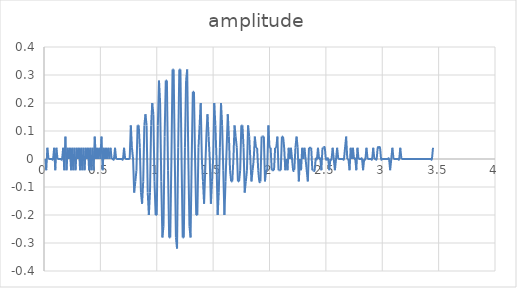
| Category | amplitude |
|---|---|
| 0.01 | 0 |
| 0.02 | -0.04 |
| 0.03 | 0.04 |
| 0.04 | 0 |
| 0.05 | 0 |
| 0.060000000000000005 | 0 |
| 0.07 | 0 |
| 0.08 | 0 |
| 0.09 | 0.04 |
| 0.09999999999999999 | -0.04 |
| 0.10999999999999999 | 0.04 |
| 0.11999999999999998 | 0 |
| 0.12999999999999998 | 0 |
| 0.13999999999999999 | 0 |
| 0.15 | 0 |
| 0.16 | 0 |
| 0.17 | 0.04 |
| 0.18000000000000002 | -0.04 |
| 0.19000000000000003 | 0.08 |
| 0.20000000000000004 | -0.04 |
| 0.21000000000000005 | 0.04 |
| 0.22000000000000006 | 0 |
| 0.23000000000000007 | 0.04 |
| 0.24000000000000007 | -0.04 |
| 0.25000000000000006 | 0.04 |
| 0.26000000000000006 | -0.04 |
| 0.2700000000000001 | 0.04 |
| 0.2800000000000001 | -0.04 |
| 0.2900000000000001 | 0.04 |
| 0.3000000000000001 | 0 |
| 0.3100000000000001 | 0.04 |
| 0.3200000000000001 | -0.04 |
| 0.3300000000000001 | 0.04 |
| 0.34000000000000014 | -0.04 |
| 0.35000000000000014 | 0.04 |
| 0.36000000000000015 | -0.04 |
| 0.37000000000000016 | 0.04 |
| 0.38000000000000017 | 0 |
| 0.3900000000000002 | 0.04 |
| 0.4000000000000002 | -0.04 |
| 0.4100000000000002 | 0.04 |
| 0.4200000000000002 | -0.04 |
| 0.4300000000000002 | 0.04 |
| 0.4400000000000002 | -0.04 |
| 0.45000000000000023 | 0.08 |
| 0.46000000000000024 | 0 |
| 0.47000000000000025 | 0.04 |
| 0.48000000000000026 | 0 |
| 0.49000000000000027 | 0.04 |
| 0.5000000000000002 | 0 |
| 0.5100000000000002 | 0.08 |
| 0.5200000000000002 | -0.04 |
| 0.5300000000000002 | 0.04 |
| 0.5400000000000003 | 0 |
| 0.5500000000000003 | 0.04 |
| 0.5600000000000003 | 0 |
| 0.5700000000000003 | 0.04 |
| 0.5800000000000003 | 0 |
| 0.5900000000000003 | 0.04 |
| 0.6000000000000003 | 0 |
| 0.6100000000000003 | 0 |
| 0.6200000000000003 | 0 |
| 0.6300000000000003 | 0.04 |
| 0.6400000000000003 | 0 |
| 0.6500000000000004 | 0 |
| 0.6600000000000004 | 0 |
| 0.6700000000000004 | 0 |
| 0.6800000000000004 | 0 |
| 0.6900000000000004 | 0 |
| 0.7000000000000004 | 0 |
| 0.7100000000000004 | 0.04 |
| 0.7200000000000004 | 0 |
| 0.7300000000000004 | 0 |
| 0.7400000000000004 | 0 |
| 0.7500000000000004 | 0 |
| 0.7600000000000005 | 0 |
| 0.7700000000000005 | 0.12 |
| 0.7800000000000005 | 0.04 |
| 0.7900000000000005 | 0 |
| 0.8000000000000005 | -0.12 |
| 0.8100000000000005 | -0.08 |
| 0.8200000000000005 | -0.04 |
| 0.8300000000000005 | 0.12 |
| 0.8400000000000005 | 0.12 |
| 0.8500000000000005 | 0.04 |
| 0.8600000000000005 | -0.12 |
| 0.8700000000000006 | -0.16 |
| 0.8800000000000006 | -0.08 |
| 0.8900000000000006 | 0.12 |
| 0.9000000000000006 | 0.16 |
| 0.9100000000000006 | 0.12 |
| 0.9200000000000006 | -0.12 |
| 0.9300000000000006 | -0.2 |
| 0.9400000000000006 | -0.12 |
| 0.9500000000000006 | 0.12 |
| 0.9600000000000006 | 0.2 |
| 0.9700000000000006 | 0.16 |
| 0.9800000000000006 | -0.08 |
| 0.9900000000000007 | -0.2 |
| 1.0000000000000007 | -0.2 |
| 1.0100000000000007 | 0.12 |
| 1.0200000000000007 | 0.28 |
| 1.0300000000000007 | 0.2 |
| 1.0400000000000007 | -0.08 |
| 1.0500000000000007 | -0.28 |
| 1.0600000000000007 | -0.24 |
| 1.0700000000000007 | 0.08 |
| 1.0800000000000007 | 0.28 |
| 1.0900000000000007 | 0.28 |
| 1.1000000000000008 | -0.04 |
| 1.1100000000000008 | -0.28 |
| 1.1200000000000008 | -0.28 |
| 1.1300000000000008 | 0 |
| 1.1400000000000008 | 0.32 |
| 1.1500000000000008 | 0.32 |
| 1.1600000000000008 | 0 |
| 1.1700000000000008 | -0.28 |
| 1.1800000000000008 | -0.32 |
| 1.1900000000000008 | 0.04 |
| 1.2000000000000008 | 0.32 |
| 1.2100000000000009 | 0.32 |
| 1.2200000000000009 | 0 |
| 1.2300000000000009 | -0.28 |
| 1.2400000000000009 | -0.28 |
| 1.2500000000000009 | 0.04 |
| 1.260000000000001 | 0.28 |
| 1.270000000000001 | 0.32 |
| 1.280000000000001 | 0 |
| 1.290000000000001 | -0.24 |
| 1.300000000000001 | -0.28 |
| 1.310000000000001 | 0 |
| 1.320000000000001 | 0.24 |
| 1.330000000000001 | 0.24 |
| 1.340000000000001 | 0 |
| 1.350000000000001 | -0.2 |
| 1.360000000000001 | -0.2 |
| 1.370000000000001 | 0.04 |
| 1.380000000000001 | 0.12 |
| 1.390000000000001 | 0.2 |
| 1.400000000000001 | 0 |
| 1.410000000000001 | -0.08 |
| 1.420000000000001 | -0.16 |
| 1.430000000000001 | -0.04 |
| 1.440000000000001 | 0.08 |
| 1.450000000000001 | 0.16 |
| 1.460000000000001 | 0.08 |
| 1.470000000000001 | 0 |
| 1.480000000000001 | -0.16 |
| 1.490000000000001 | -0.08 |
| 1.500000000000001 | 0 |
| 1.5100000000000011 | 0.2 |
| 1.5200000000000011 | 0.12 |
| 1.5300000000000011 | 0 |
| 1.5400000000000011 | -0.2 |
| 1.5500000000000012 | -0.12 |
| 1.5600000000000012 | 0.04 |
| 1.5700000000000012 | 0.2 |
| 1.5800000000000012 | 0.12 |
| 1.5900000000000012 | -0.04 |
| 1.6000000000000012 | -0.2 |
| 1.6100000000000012 | -0.08 |
| 1.6200000000000012 | 0.04 |
| 1.6300000000000012 | 0.16 |
| 1.6400000000000012 | 0.08 |
| 1.6500000000000012 | -0.04 |
| 1.6600000000000013 | -0.08 |
| 1.6700000000000013 | -0.08 |
| 1.6800000000000013 | 0 |
| 1.6900000000000013 | 0.12 |
| 1.7000000000000013 | 0.08 |
| 1.7100000000000013 | 0.04 |
| 1.7200000000000013 | -0.08 |
| 1.7300000000000013 | -0.08 |
| 1.7400000000000013 | -0.04 |
| 1.7500000000000013 | 0.12 |
| 1.7600000000000013 | 0.12 |
| 1.7700000000000014 | 0.04 |
| 1.7800000000000014 | -0.12 |
| 1.7900000000000014 | -0.08 |
| 1.8000000000000014 | -0.04 |
| 1.8100000000000014 | 0.12 |
| 1.8200000000000014 | 0.08 |
| 1.8300000000000014 | 0 |
| 1.8400000000000014 | -0.08 |
| 1.8500000000000014 | -0.04 |
| 1.8600000000000014 | 0 |
| 1.8700000000000014 | 0.08 |
| 1.8800000000000014 | 0.04 |
| 1.8900000000000015 | 0.04 |
| 1.9000000000000015 | -0.04 |
| 1.9100000000000015 | -0.08 |
| 1.9200000000000015 | -0.08 |
| 1.9300000000000015 | 0.08 |
| 1.9400000000000015 | 0.08 |
| 1.9500000000000015 | 0.08 |
| 1.9600000000000015 | -0.08 |
| 1.9700000000000015 | -0.04 |
| 1.9800000000000015 | -0.04 |
| 1.9900000000000015 | 0.12 |
| 2.0000000000000013 | 0.04 |
| 2.010000000000001 | 0.04 |
| 2.020000000000001 | -0.04 |
| 2.0300000000000007 | -0.04 |
| 2.0400000000000005 | -0.04 |
| 2.0500000000000003 | 0.04 |
| 2.06 | 0.04 |
| 2.07 | 0.08 |
| 2.0799999999999996 | -0.04 |
| 2.0899999999999994 | -0.04 |
| 2.099999999999999 | -0.04 |
| 2.109999999999999 | 0.08 |
| 2.1199999999999988 | 0.08 |
| 2.1299999999999986 | 0.04 |
| 2.1399999999999983 | -0.04 |
| 2.149999999999998 | 0 |
| 2.159999999999998 | -0.04 |
| 2.1699999999999977 | 0.04 |
| 2.1799999999999975 | 0 |
| 2.1899999999999973 | 0.04 |
| 2.199999999999997 | 0 |
| 2.209999999999997 | -0.04 |
| 2.2199999999999966 | -0.04 |
| 2.2299999999999964 | 0.04 |
| 2.239999999999996 | 0.08 |
| 2.249999999999996 | 0.04 |
| 2.259999999999996 | -0.08 |
| 2.2699999999999956 | 0 |
| 2.2799999999999954 | -0.04 |
| 2.289999999999995 | 0.04 |
| 2.299999999999995 | 0 |
| 2.3099999999999947 | 0.04 |
| 2.3199999999999945 | 0 |
| 2.3299999999999943 | -0.04 |
| 2.339999999999994 | -0.08 |
| 2.349999999999994 | 0.04 |
| 2.3599999999999937 | 0.04 |
| 2.3699999999999934 | 0.04 |
| 2.3799999999999932 | -0.04 |
| 2.389999999999993 | -0.04 |
| 2.399999999999993 | -0.04 |
| 2.4099999999999926 | 0 |
| 2.4199999999999924 | 0 |
| 2.429999999999992 | 0.04 |
| 2.439999999999992 | 0 |
| 2.4499999999999917 | 0 |
| 2.4599999999999915 | -0.04 |
| 2.4699999999999913 | 0.04 |
| 2.479999999999991 | 0.04 |
| 2.489999999999991 | 0.04 |
| 2.4999999999999907 | 0 |
| 2.5099999999999905 | 0 |
| 2.5199999999999902 | 0 |
| 2.52999999999999 | -0.04 |
| 2.53999999999999 | 0 |
| 2.5499999999999896 | 0 |
| 2.5599999999999894 | 0.04 |
| 2.569999999999989 | 0 |
| 2.579999999999989 | -0.04 |
| 2.5899999999999888 | 0 |
| 2.5999999999999885 | 0.04 |
| 2.6099999999999883 | 0 |
| 2.619999999999988 | 0 |
| 2.629999999999988 | 0 |
| 2.6399999999999877 | 0 |
| 2.6499999999999875 | 0 |
| 2.6599999999999873 | 0 |
| 2.669999999999987 | 0.04 |
| 2.679999999999987 | 0.08 |
| 2.6899999999999866 | 0 |
| 2.6999999999999864 | 0 |
| 2.709999999999986 | -0.04 |
| 2.719999999999986 | 0.04 |
| 2.7299999999999858 | 0 |
| 2.7399999999999856 | 0.04 |
| 2.7499999999999853 | 0 |
| 2.759999999999985 | 0 |
| 2.769999999999985 | -0.04 |
| 2.7799999999999847 | 0.04 |
| 2.7899999999999845 | 0 |
| 2.7999999999999843 | 0 |
| 2.809999999999984 | 0 |
| 2.819999999999984 | 0 |
| 2.8299999999999836 | -0.04 |
| 2.8399999999999834 | 0 |
| 2.849999999999983 | 0 |
| 2.859999999999983 | 0.04 |
| 2.869999999999983 | 0 |
| 2.8799999999999826 | 0 |
| 2.8899999999999824 | 0 |
| 2.899999999999982 | 0 |
| 2.909999999999982 | 0 |
| 2.9199999999999817 | 0.04 |
| 2.9299999999999815 | 0 |
| 2.9399999999999813 | 0 |
| 2.949999999999981 | 0 |
| 2.959999999999981 | 0.04 |
| 2.9699999999999807 | 0.04 |
| 2.9799999999999804 | 0.04 |
| 2.9899999999999802 | 0 |
| 2.99999999999998 | 0 |
| 3.00999999999998 | 0 |
| 3.0199999999999796 | 0 |
| 3.0299999999999794 | 0 |
| 3.039999999999979 | 0 |
| 3.049999999999979 | 0 |
| 3.0599999999999787 | 0 |
| 3.0699999999999785 | -0.04 |
| 3.0799999999999783 | 0 |
| 3.089999999999978 | 0.04 |
| 3.099999999999978 | 0 |
| 3.1099999999999777 | 0 |
| 3.1199999999999775 | 0 |
| 3.1299999999999772 | 0 |
| 3.139999999999977 | 0 |
| 3.149999999999977 | 0 |
| 3.1599999999999766 | 0.04 |
| 3.1699999999999764 | 0 |
| 3.179999999999976 | 0 |
| 3.189999999999976 | 0 |
| 3.1999999999999758 | 0 |
| 3.2099999999999755 | 0 |
| 3.2199999999999753 | 0 |
| 3.229999999999975 | 0 |
| 3.239999999999975 | 0 |
| 3.2499999999999747 | 0 |
| 3.2599999999999745 | 0 |
| 3.2699999999999743 | 0 |
| 3.279999999999974 | 0 |
| 3.289999999999974 | 0 |
| 3.2999999999999736 | 0 |
| 3.3099999999999734 | 0 |
| 3.319999999999973 | 0 |
| 3.329999999999973 | 0 |
| 3.3399999999999728 | 0 |
| 3.3499999999999726 | 0 |
| 3.3599999999999723 | 0 |
| 3.369999999999972 | 0 |
| 3.379999999999972 | 0 |
| 3.3899999999999717 | 0 |
| 3.3999999999999715 | 0 |
| 3.4099999999999713 | 0 |
| 3.419999999999971 | 0 |
| 3.429999999999971 | 0 |
| 3.4399999999999706 | 0 |
| 3.4499999999999704 | 0.04 |